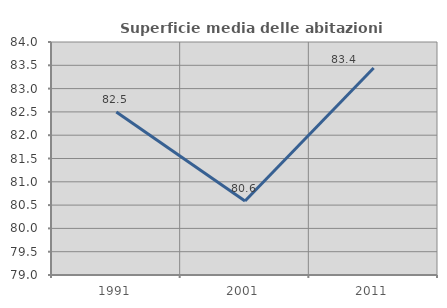
| Category | Superficie media delle abitazioni occupate |
|---|---|
| 1991.0 | 82.498 |
| 2001.0 | 80.59 |
| 2011.0 | 83.442 |